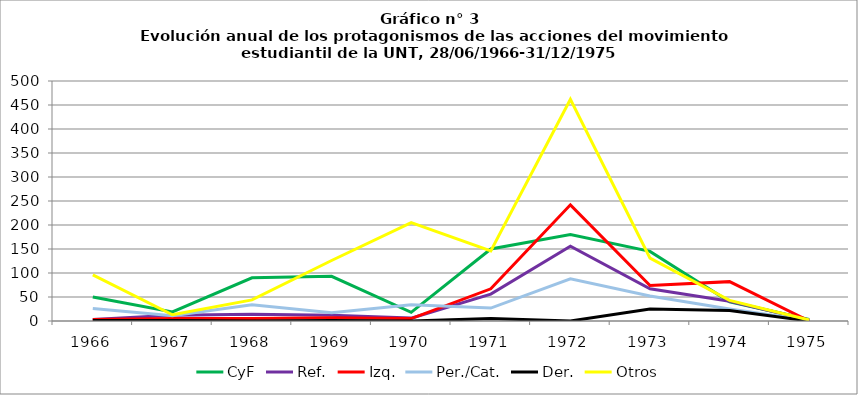
| Category | CyF | Ref. | Izq. | Per./Cat. | Der. | Otros |
|---|---|---|---|---|---|---|
| 1966.0 | 50 | 3 | 3 | 26 | 1 | 96 |
| 1967.0 | 19 | 12 | 5 | 11 | 1 | 13 |
| 1968.0 | 90 | 14 | 5 | 34 | 0 | 44 |
| 1969.0 | 93 | 12 | 7 | 17 | 1 | 126 |
| 1970.0 | 18 | 6 | 5 | 34 | 0 | 205 |
| 1971.0 | 150 | 56 | 67 | 27 | 5 | 146 |
| 1972.0 | 180 | 156 | 242 | 88 | 0 | 462 |
| 1973.0 | 145 | 67 | 74 | 52 | 25 | 131 |
| 1974.0 | 40 | 41 | 82 | 25 | 22 | 43 |
| 1975.0 | 3 | 2 | 0 | 1 | 0 | 2 |